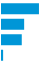
| Category | Series 0 |
|---|---|
| 0 | 0.462 |
| 1 | 0.277 |
| 2 | 0.247 |
| 3 | 0.014 |